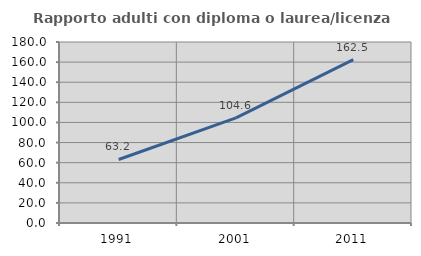
| Category | Rapporto adulti con diploma o laurea/licenza media  |
|---|---|
| 1991.0 | 63.184 |
| 2001.0 | 104.553 |
| 2011.0 | 162.492 |